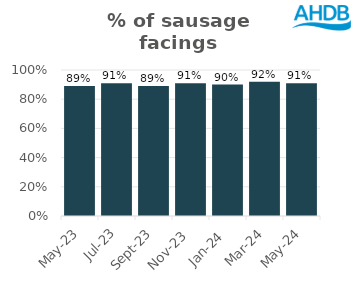
| Category | Sausage |
|---|---|
| 2023-05-01 | 0.89 |
| 2023-07-01 | 0.91 |
| 2023-09-01 | 0.89 |
| 2023-11-01 | 0.91 |
| 2024-01-01 | 0.9 |
| 2024-03-01 | 0.92 |
| 2024-05-01 | 0.91 |